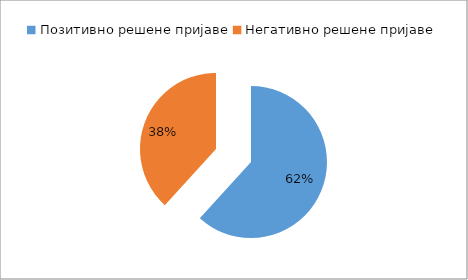
| Category | Series 0 |
|---|---|
| Позитивно решене пријаве | 0.618 |
| Негативно решене пријаве | 0.382 |